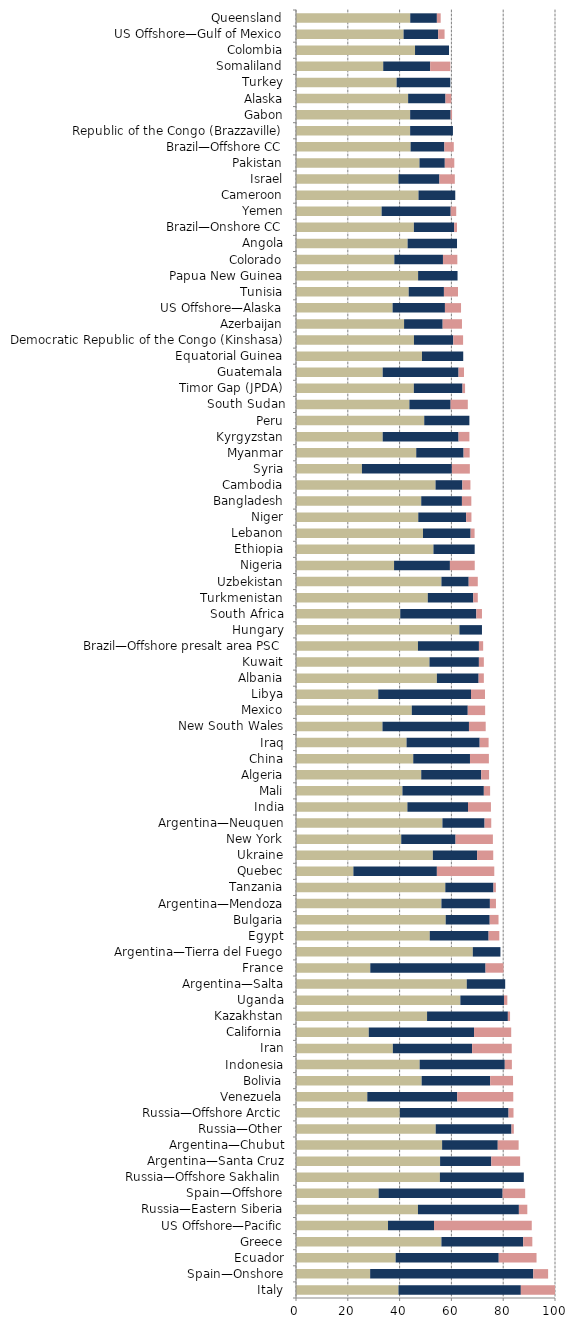
| Category |   Mild deterrent to investment |   Strong deterrent to investment |   Would not pursue investment due to this factor |
|---|---|---|---|
| Italy | 39.56 | 47.253 | 13.187 |
| Spain—Onshore | 28.629 | 62.984 | 5.726 |
| Ecuador | 38.475 | 39.802 | 14.594 |
| Greece | 56.15 | 31.585 | 3.509 |
| US Offshore—Pacific | 35.524 | 17.762 | 37.744 |
| Russia—Eastern Siberia | 47.089 | 38.97 | 3.247 |
| Spain—Offshore | 31.912 | 47.868 | 8.703 |
| Russia—Offshore Sakhalin | 55.553 | 32.406 | 0 |
| Argentina—Santa Cruz | 55.632 | 19.78 | 11.126 |
| Argentina—Chubut | 56.41 | 21.49 | 8.059 |
| Russia—Other | 53.938 | 29.255 | 0.914 |
| Russia—Offshore Arctic | 40.081 | 41.99 | 1.909 |
| Venezuela | 27.525 | 34.735 | 21.627 |
| Bolivia | 48.515 | 26.463 | 8.821 |
| Indonesia | 47.743 | 32.872 | 2.739 |
| Iran | 37.397 | 30.598 | 15.299 |
| California | 28.094 | 40.647 | 14.346 |
| Kazakhstan | 50.601 | 31.204 | 0.843 |
| Uganda | 63.462 | 16.837 | 1.295 |
| Argentina—Salta | 65.934 | 14.835 | 0 |
| France | 28.681 | 44.505 | 6.923 |
| Argentina—Tierra del Fuego | 68.261 | 10.666 | 0 |
| Egypt | 51.641 | 22.722 | 4.131 |
| Bulgaria | 57.795 | 16.999 | 3.4 |
| Argentina—Mendoza | 56.15 | 18.717 | 2.34 |
| Tanzania | 57.65 | 18.597 | 0.93 |
| Quebec | 22.161 | 32.234 | 22.161 |
| Ukraine | 52.841 | 17.096 | 6.217 |
| New York | 40.633 | 20.972 | 14.418 |
| Argentina—Neuquen | 56.537 | 16.276 | 2.57 |
| India | 43.01 | 23.403 | 8.855 |
| Mali | 41.099 | 31.429 | 2.418 |
| Algeria | 48.352 | 23.168 | 3.022 |
| China | 45.269 | 21.904 | 7.301 |
| Iraq | 42.69 | 28.231 | 3.443 |
| New South Wales | 33.391 | 33.391 | 6.463 |
| Mexico | 44.709 | 21.609 | 6.706 |
| Libya | 31.759 | 35.813 | 5.406 |
| Albania | 54.396 | 16.117 | 2.015 |
| Kuwait | 51.533 | 19.086 | 1.909 |
| Brazil—Offshore presalt area PSC | 47.089 | 23.544 | 1.624 |
| Hungary | 63.099 | 8.703 | 0 |
| South Africa | 40.253 | 29.374 | 2.176 |
| Turkmenistan | 50.886 | 17.547 | 1.755 |
| Uzbekistan | 56.15 | 10.528 | 3.509 |
| Nigeria | 37.861 | 21.567 | 9.585 |
| Ethiopia | 53.069 | 15.921 | 0 |
| Lebanon | 49.033 | 18.387 | 1.532 |
| Niger | 47.211 | 18.474 | 2.053 |
| Bangladesh | 48.352 | 15.714 | 3.626 |
| Cambodia | 53.878 | 10.361 | 3.108 |
| Syria | 25.462 | 34.721 | 6.944 |
| Myanmar | 46.424 | 18.288 | 2.345 |
| Kyrgyzstan | 33.474 | 29.29 | 4.184 |
| Peru | 49.514 | 17.434 | 0 |
| South Sudan | 43.782 | 15.921 | 6.634 |
| Timor Gap (JPDA) | 45.495 | 18.791 | 0.989 |
| Guatemala | 33.474 | 29.29 | 2.092 |
| Equatorial Guinea | 48.646 | 15.921 | 0 |
| Democratic Republic of the Congo (Kinshasa) | 45.541 | 15.18 | 3.795 |
| Azerbaijan | 41.728 | 14.903 | 7.451 |
| US Offshore—Alaska | 37.3 | 20.204 | 6.217 |
| Tunisia | 43.516 | 13.599 | 5.44 |
| Papua New Guinea | 47.143 | 15.231 | 0 |
| Colorado | 37.97 | 18.772 | 5.546 |
| Angola | 43.093 | 19.074 | 0 |
| Brazil—Onshore CC | 45.515 | 15.542 | 1.11 |
| Yemen | 33.064 | 26.665 | 2.133 |
| Cameroon | 47.301 | 14.19 | 0 |
| Israel | 39.56 | 15.824 | 5.934 |
| Pakistan | 47.673 | 9.779 | 3.667 |
| Brazil—Offshore CC | 44.242 | 13.055 | 3.626 |
| Republic of the Congo (Brazzaville) | 44.067 | 16.525 | 0 |
| Gabon | 44.074 | 15.621 | 0.558 |
| Alaska | 43.294 | 14.431 | 2.22 |
| Turkey | 38.854 | 20.722 | 0 |
| Somaliland | 33.673 | 18.132 | 7.771 |
| Colombia | 45.955 | 13.13 | 0 |
| US Offshore—Gulf of Mexico | 41.538 | 13.352 | 2.473 |
| Queensland | 44.105 | 10.291 | 1.47 |